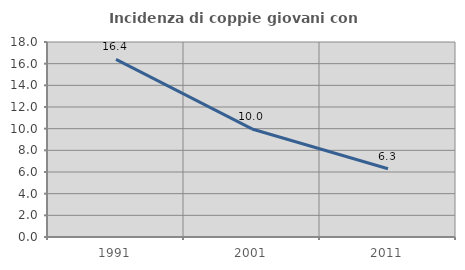
| Category | Incidenza di coppie giovani con figli |
|---|---|
| 1991.0 | 16.396 |
| 2001.0 | 9.973 |
| 2011.0 | 6.296 |